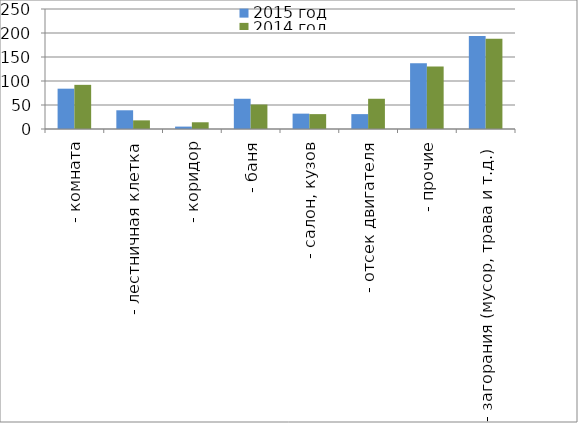
| Category | 2015 год | 2014 год |
|---|---|---|
|  - комната | 84 | 92 |
|  - лестничная клетка | 39 | 18 |
|  - коридор | 5 | 14 |
|  - баня | 63 | 51 |
|  - салон, кузов | 32 | 31 |
|  - отсек двигателя | 31 | 63 |
| - прочие | 137 | 130 |
| - загорания (мусор, трава и т.д.)  | 194 | 188 |